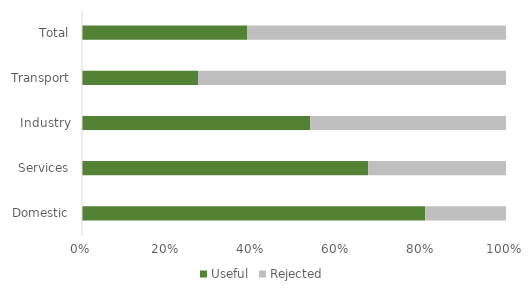
| Category | Useful | Rejected |
|---|---|---|
| Domestic | 0.809 | 0.191 |
| Services | 0.675 | 0.325 |
| Industry | 0.538 | 0.462 |
| Transport | 0.274 | 0.726 |
| Total | 0.389 | 0.611 |